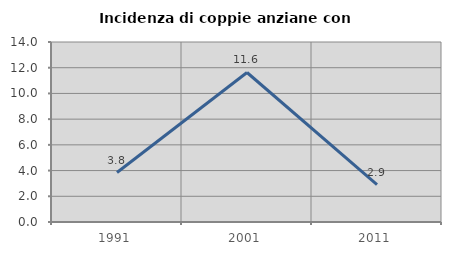
| Category | Incidenza di coppie anziane con figli |
|---|---|
| 1991.0 | 3.846 |
| 2001.0 | 11.628 |
| 2011.0 | 2.899 |